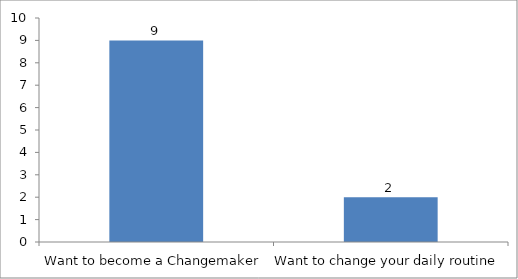
| Category | If, Yes, what are your future plans now? |
|---|---|
| Want to become a Changemaker | 9 |
| Want to change your daily routine | 2 |